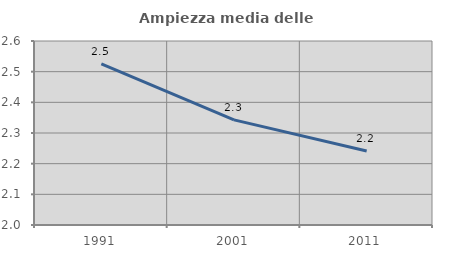
| Category | Ampiezza media delle famiglie |
|---|---|
| 1991.0 | 2.526 |
| 2001.0 | 2.343 |
| 2011.0 | 2.241 |